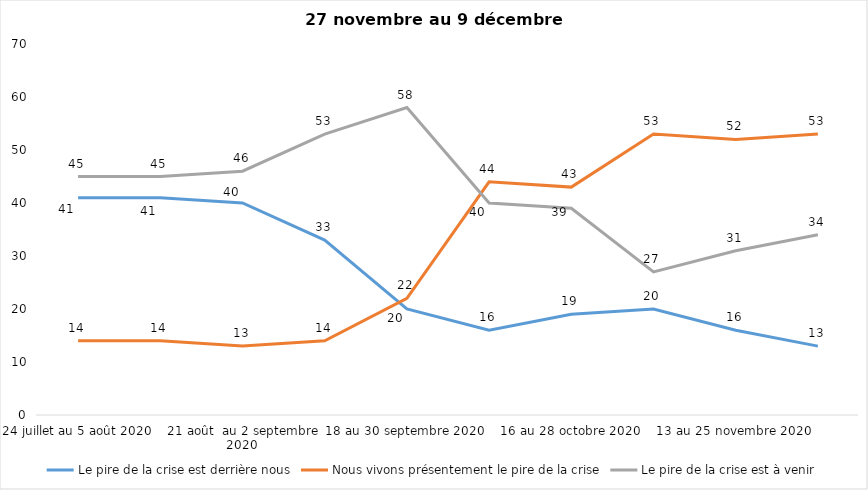
| Category | Le pire de la crise est derrière nous | Nous vivons présentement le pire de la crise | Le pire de la crise est à venir |
|---|---|---|---|
| 24 juillet au 5 août 2020 | 41 | 14 | 45 |
| 7 au 19 août 2020 | 41 | 14 | 45 |
| 21 août  au 2 septembre 2020 | 40 | 13 | 46 |
| 4 au 16 septembre 2020 | 33 | 14 | 53 |
| 18 au 30 septembre 2020 | 20 | 22 | 58 |
| 2 au 14 octobre 2020 | 16 | 44 | 40 |
| 16 au 28 octobre 2020 | 19 | 43 | 39 |
| 30 octobre au 11 novembre 2020 | 20 | 53 | 27 |
| 13 au 25 novembre 2020 | 16 | 52 | 31 |
| 27 au 9 décembre 2020 | 13 | 53 | 34 |